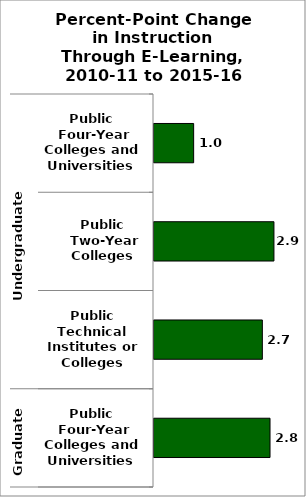
| Category | State |
|---|---|
| 0 | 0.97 |
| 1 | 2.936 |
| 2 | 2.652 |
| 3 | 2.84 |